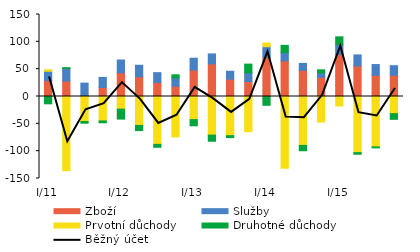
| Category | Zboží | Služby | Prvotní důchody | Druhotné důchody |
|---|---|---|---|---|
| I/11 | 28.994 | 17.24 | 2.716 | -13.37 |
| II | 28.218 | 22.874 | -135.675 | 1.741 |
| III | 1.774 | 22.739 | -45.729 | -3.187 |
| IV | 16.492 | 18.43 | -44.657 | -3.399 |
| I/12 | 43.281 | 23.478 | -23.083 | -18.258 |
| II | 36.152 | 20.972 | -52.981 | -9.36 |
| III | 25.681 | 17.923 | -87.565 | -5.364 |
| IV | 18.683 | 15.252 | -73.899 | 5.772 |
| I/13 | 48.355 | 21.702 | -42.281 | -11.28 |
| II | 59.692 | 18.186 | -70.624 | -11.218 |
| III | 31.672 | 14.458 | -71.638 | -3.56 |
| IV | 27.254 | 16.013 | -64.475 | 15.96 |
| I/14 | 71.525 | 19.636 | 6.653 | -16.093 |
| II | 65.182 | 15.226 | -131.27 | 13.191 |
| III | 47.73 | 12.825 | -89.485 | -9.728 |
| IV | 35.101 | 7.964 | -46.676 | 5.699 |
| I/15 | 76.87 | 18.007 | -17.262 | 14.268 |
| II | 56.045 | 20.023 | -102.674 | -2.957 |
| III | 38.874 | 19.58 | -92.216 | -1.788 |
| IV | 38.938 | 17.433 | -31.364 | -10.405 |